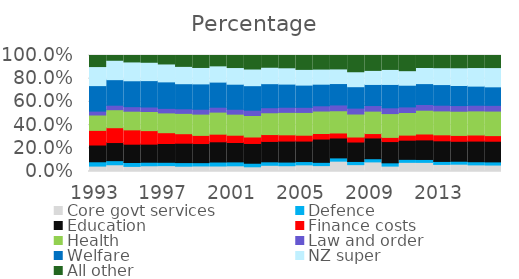
| Category |  Core govt services  |  Defence  |  Education  |  Finance costs  |  Health  |  Law and order  |  Welfare  |  NZ super  |  All other  |
|---|---|---|---|---|---|---|---|---|---|
| 1993-06-01 | 0.047 | 0.037 | 0.144 | 0.126 | 0.133 | 0.034 | 0.22 | 0.164 | 0.095 |
| 1994-06-01 | 0.058 | 0.035 | 0.156 | 0.128 | 0.155 | 0.039 | 0.22 | 0.167 | 0.041 |
| 1995-06-01 | 0.044 | 0.033 | 0.158 | 0.124 | 0.161 | 0.039 | 0.223 | 0.162 | 0.055 |
| 1996-06-01 | 0.049 | 0.031 | 0.156 | 0.117 | 0.165 | 0.039 | 0.227 | 0.158 | 0.058 |
| 1997-06-01 | 0.051 | 0.029 | 0.162 | 0.093 | 0.171 | 0.039 | 0.229 | 0.154 | 0.073 |
| 1998-06-01 | 0.046 | 0.031 | 0.167 | 0.082 | 0.175 | 0.039 | 0.216 | 0.149 | 0.094 |
| 1999-06-01 | 0.048 | 0.029 | 0.165 | 0.07 | 0.183 | 0.042 | 0.219 | 0.142 | 0.103 |
| 2000-06-01 | 0.047 | 0.034 | 0.174 | 0.066 | 0.19 | 0.042 | 0.216 | 0.14 | 0.089 |
| 2001-06-01 | 0.049 | 0.034 | 0.167 | 0.063 | 0.181 | 0.042 | 0.216 | 0.144 | 0.104 |
| 2002-06-01 | 0.041 | 0.031 | 0.17 | 0.056 | 0.185 | 0.046 | 0.212 | 0.144 | 0.117 |
| 2003-06-01 | 0.053 | 0.03 | 0.176 | 0.059 | 0.188 | 0.043 | 0.207 | 0.141 | 0.102 |
| 2004-06-01 | 0.05 | 0.031 | 0.181 | 0.054 | 0.194 | 0.044 | 0.2 | 0.141 | 0.106 |
| 2005-06-01 | 0.057 | 0.028 | 0.177 | 0.051 | 0.196 | 0.044 | 0.192 | 0.135 | 0.12 |
| 2006-06-01 | 0.051 | 0.028 | 0.201 | 0.048 | 0.194 | 0.045 | 0.186 | 0.13 | 0.117 |
| 2007-06-01 | 0.089 | 0.028 | 0.172 | 0.043 | 0.192 | 0.05 | 0.184 | 0.126 | 0.116 |
| 2008-06-01 | 0.059 | 0.027 | 0.168 | 0.043 | 0.198 | 0.051 | 0.185 | 0.129 | 0.14 |
| 2009-06-01 | 0.083 | 0.027 | 0.179 | 0.038 | 0.193 | 0.048 | 0.182 | 0.121 | 0.129 |
| 2010-06-01 | 0.046 | 0.028 | 0.183 | 0.036 | 0.205 | 0.05 | 0.201 | 0.13 | 0.12 |
| 2011-06-01 | 0.079 | 0.026 | 0.165 | 0.044 | 0.195 | 0.048 | 0.187 | 0.125 | 0.131 |
| 2012-06-01 | 0.079 | 0.025 | 0.169 | 0.051 | 0.205 | 0.049 | 0.18 | 0.139 | 0.104 |
| 2013-06-01 | 0.061 | 0.026 | 0.178 | 0.051 | 0.206 | 0.049 | 0.178 | 0.146 | 0.105 |
| 2014-06-01 | 0.063 | 0.025 | 0.172 | 0.051 | 0.208 | 0.049 | 0.173 | 0.153 | 0.106 |
| 2015-06-01 | 0.057 | 0.027 | 0.178 | 0.052 | 0.208 | 0.049 | 0.165 | 0.16 | 0.104 |
| 2016-06-01 | 0.055 | 0.027 | 0.178 | 0.049 | 0.211 | 0.049 | 0.16 | 0.166 | 0.104 |